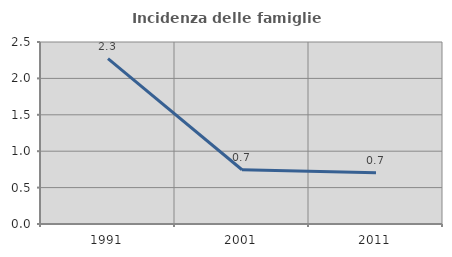
| Category | Incidenza delle famiglie numerose |
|---|---|
| 1991.0 | 2.273 |
| 2001.0 | 0.745 |
| 2011.0 | 0.703 |